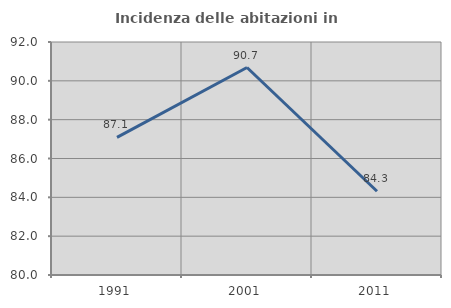
| Category | Incidenza delle abitazioni in proprietà  |
|---|---|
| 1991.0 | 87.087 |
| 2001.0 | 90.685 |
| 2011.0 | 84.314 |